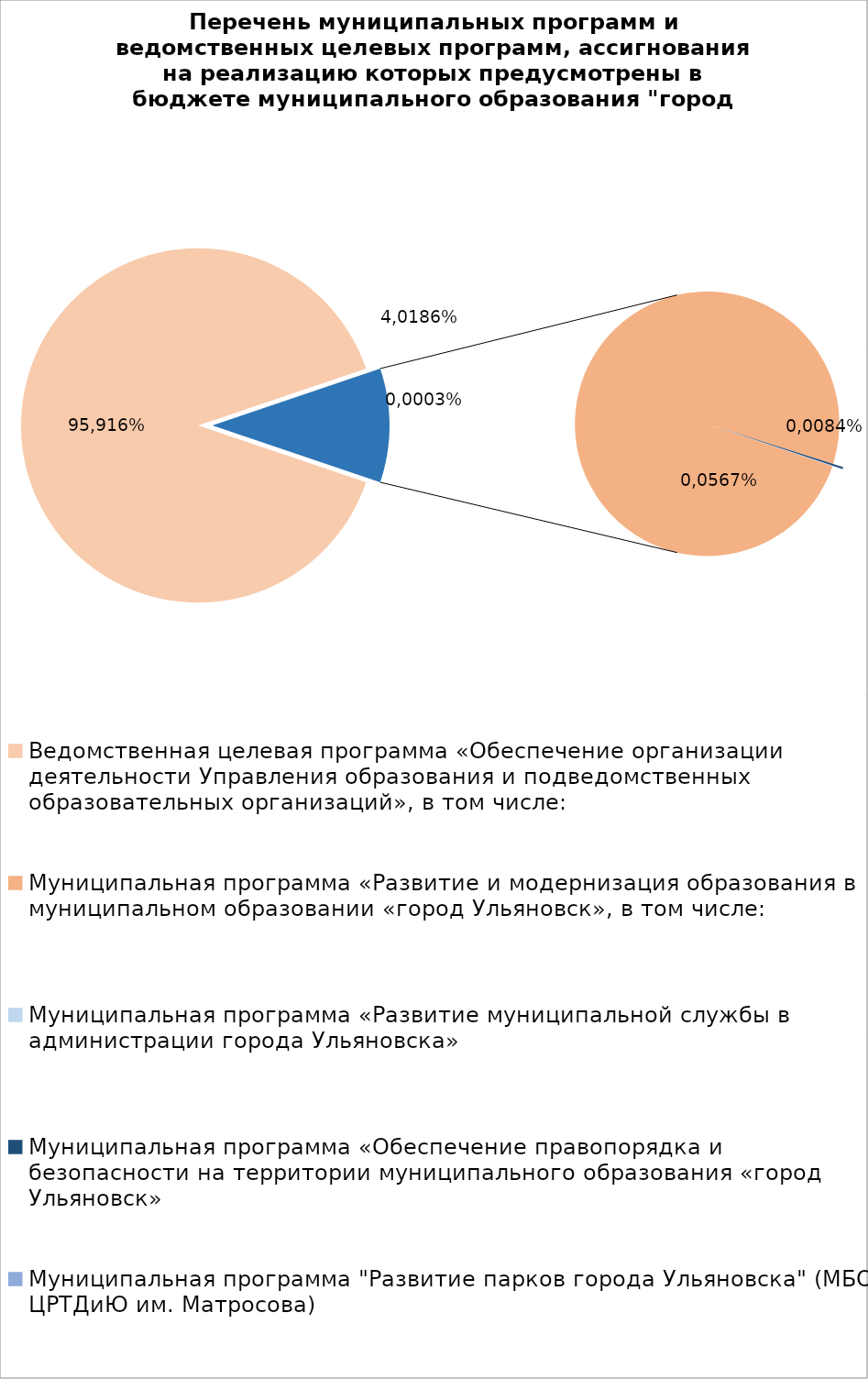
| Category | Series 0 |
|---|---|
| Ведомственная целевая программа «Обеспечение организации деятельности Управления образования и подведомственных образовательных организаций», в том числе: | 7850643.79 |
| Муниципальная программа «Развитие и модернизация образования в муниципальном образовании «город Ульяновск», в том числе: | 907826.34 |
| Муниципальная программа «Развитие муниципальной службы в администрации города Ульяновска» | 14.3 |
| Муниципальная программа «Обеспечение правопорядка и безопасности на территории муниципального образования «город Ульяновск» | 2100.73 |
| Муниципальная программа "Развитие парков города Ульяновска" (МБОУ ЦРТДиЮ им. Матросова) | 600 |